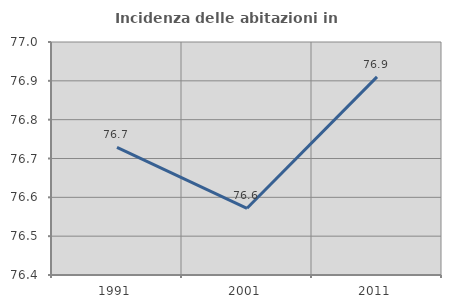
| Category | Incidenza delle abitazioni in proprietà  |
|---|---|
| 1991.0 | 76.728 |
| 2001.0 | 76.572 |
| 2011.0 | 76.91 |